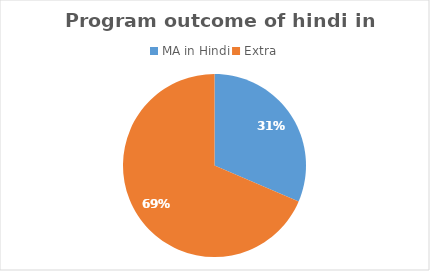
| Category | Series 0 |
|---|---|
| MA in Hindi | 11 |
| Extra | 24 |